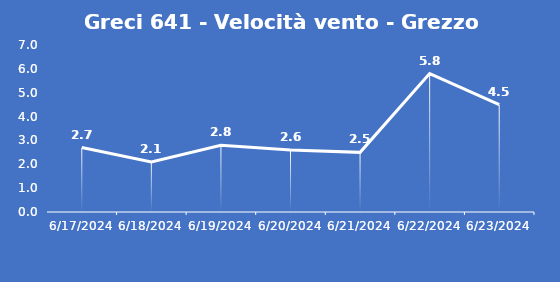
| Category | Greci 641 - Velocità vento - Grezzo (m/s) |
|---|---|
| 6/17/24 | 2.7 |
| 6/18/24 | 2.1 |
| 6/19/24 | 2.8 |
| 6/20/24 | 2.6 |
| 6/21/24 | 2.5 |
| 6/22/24 | 5.8 |
| 6/23/24 | 4.5 |